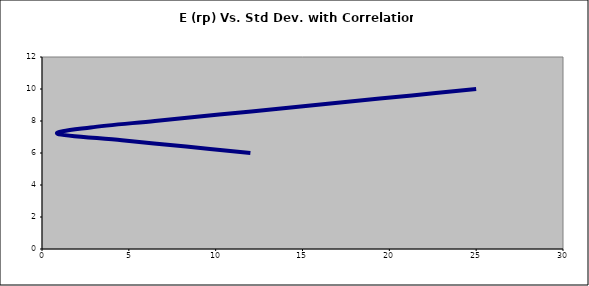
| Category | Series 0 |
|---|---|
| 12.0 | 6 |
| 8.3 | 6.4 |
| 4.600000000000002 | 6.8 |
| 0.8999999999999855 | 7.2 |
| 2.7999999999999954 | 7.6 |
| 6.5 | 8 |
| 10.200000000000001 | 8.4 |
| 13.899999999999999 | 8.8 |
| 17.6 | 9.2 |
| 21.299999999999994 | 9.6 |
| 24.999999999999996 | 10 |